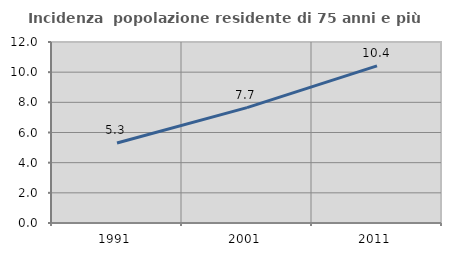
| Category | Incidenza  popolazione residente di 75 anni e più |
|---|---|
| 1991.0 | 5.301 |
| 2001.0 | 7.651 |
| 2011.0 | 10.417 |